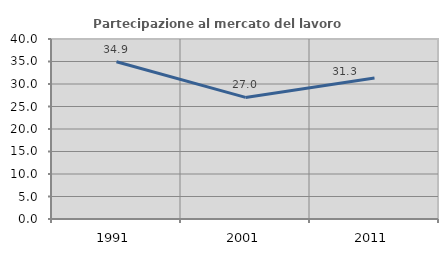
| Category | Partecipazione al mercato del lavoro  femminile |
|---|---|
| 1991.0 | 34.929 |
| 2001.0 | 27.022 |
| 2011.0 | 31.315 |